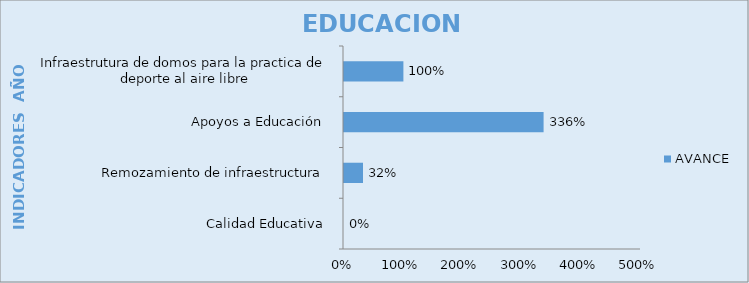
| Category | AVANCE |
|---|---|
| Calidad Educativa  | 0 |
| Remozamiento de infraestructura  | 0.32 |
| Apoyos a Educación  | 3.36 |
| Infraestrutura de domos para la practica de deporte al aire libre | 1 |